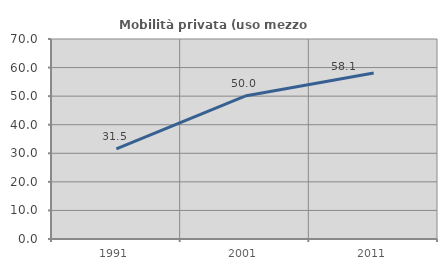
| Category | Mobilità privata (uso mezzo privato) |
|---|---|
| 1991.0 | 31.508 |
| 2001.0 | 50.043 |
| 2011.0 | 58.071 |